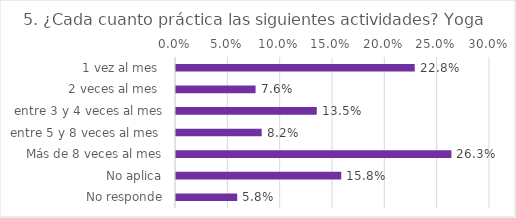
| Category | Series 0 |
|---|---|
| 1 vez al mes  | 0.228 |
| 2 veces al mes  | 0.076 |
| entre 3 y 4 veces al mes | 0.135 |
| entre 5 y 8 veces al mes  | 0.082 |
| Más de 8 veces al mes | 0.263 |
| No aplica | 0.158 |
| No responde | 0.058 |